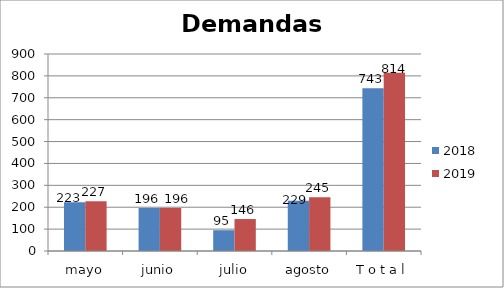
| Category | 2018 | 2019 |
|---|---|---|
| mayo | 223 | 227 |
| junio | 196 | 196 |
| julio | 95 | 146 |
| agosto | 229 | 245 |
| T o t a l | 743 | 814 |